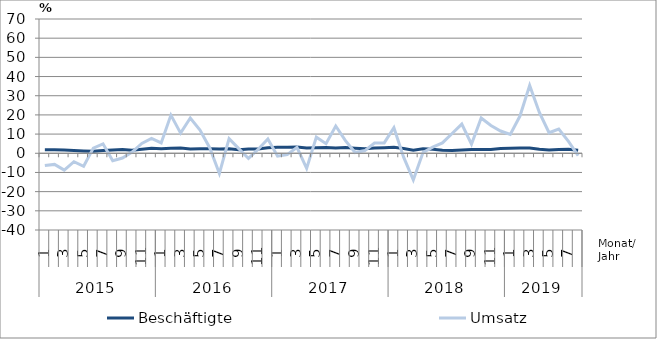
| Category | Beschäftigte | Umsatz |
|---|---|---|
| 0 | 1.8 | -6.4 |
| 1 | 1.8 | -5.8 |
| 2 | 1.7 | -8.8 |
| 3 | 1.5 | -4.4 |
| 4 | 1.2 | -6.8 |
| 5 | 1 | 2.7 |
| 6 | 1.4 | 4.9 |
| 7 | 1.7 | -3.9 |
| 8 | 2 | -2.5 |
| 9 | 1.6 | 0.6 |
| 10 | 2.1 | 5.1 |
| 11 | 2.6 | 7.7 |
| 12 | 2.4 | 5.4 |
| 13 | 2.6 | 19.9 |
| 14 | 2.7 | 10.5 |
| 15 | 2.2 | 18.4 |
| 16 | 2.3 | 12.1 |
| 17 | 2.3 | 2.9 |
| 18 | 2.2 | -10.5 |
| 19 | 2.4 | 7.6 |
| 20 | 1.8 | 2.4 |
| 21 | 2.2 | -2.7 |
| 22 | 2.2 | 2.1 |
| 23 | 2.9 | 7.4 |
| 24 | 3.2 | -1.5 |
| 25 | 3.2 | -0.7 |
| 26 | 3.3 | 3.1 |
| 27 | 2.7 | -7.9 |
| 28 | 2.9 | 8.4 |
| 29 | 3 | 5 |
| 30 | 2.8 | 14.2 |
| 31 | 3 | 6.6 |
| 32 | 2.6 | 0.4 |
| 33 | 2.3 | 1.4 |
| 34 | 2.7 | 5.3 |
| 35 | 2.9 | 5.4 |
| 36 | 3.1 | 13.3 |
| 37 | 2.5 | -2 |
| 38 | 1.6 | -13.9 |
| 39 | 2.4 | 0.4 |
| 40 | 2.1 | 3.2 |
| 41 | 1.6 | 5.4 |
| 42 | 1.5 | 10.3 |
| 43 | 1.7 | 15.2 |
| 44 | 2 | 4.7 |
| 45 | 2 | 18.4 |
| 46 | 2 | 14.5 |
| 47 | 2.5 | 11.6 |
| 48 | 2.6 | 9.8 |
| 49 | 2.8 | 19.4 |
| 50 | 2.8 | 35.4 |
| 51 | 2.1 | 21.3 |
| 52 | 1.7 | 10.7 |
| 53 | 2 | 12.6 |
| 54 | 2.1 | 6.2 |
| 55 | 1.6 | -1.2 |